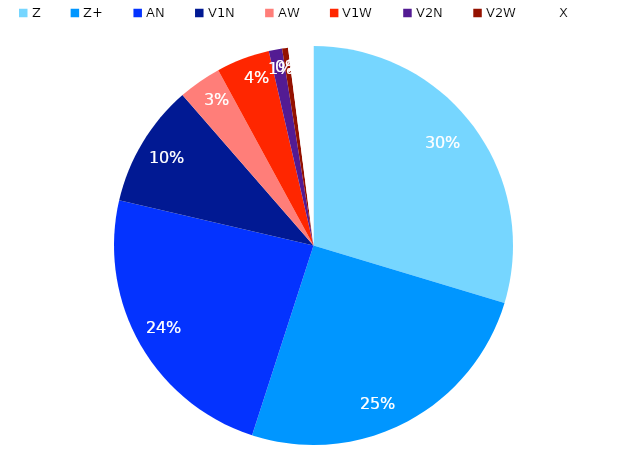
| Category | Tot |
|---|---|
| Z | 247 |
| Z+ | 211 |
| AN | 197 |
| V1N | 83 |
| AW | 29 |
| V1W | 36 |
| V2N | 9 |
| V2W | 4 |
| X | 17 |